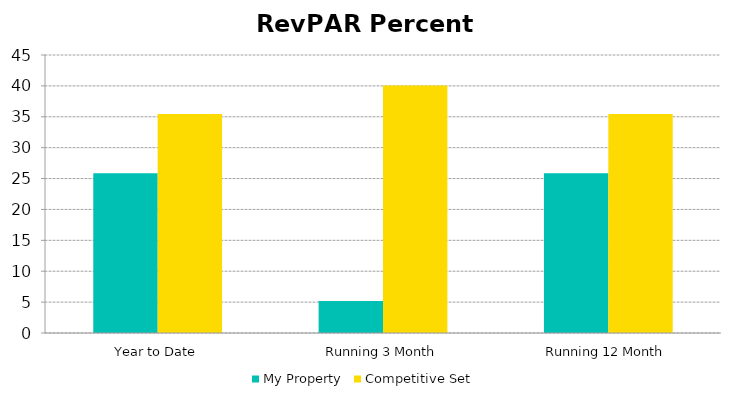
| Category | My Property | Competitive Set |
|---|---|---|
| Year to Date | 25.844 | 35.461 |
| Running 3 Month | 5.168 | 40.069 |
| Running 12 Month | 25.844 | 35.461 |